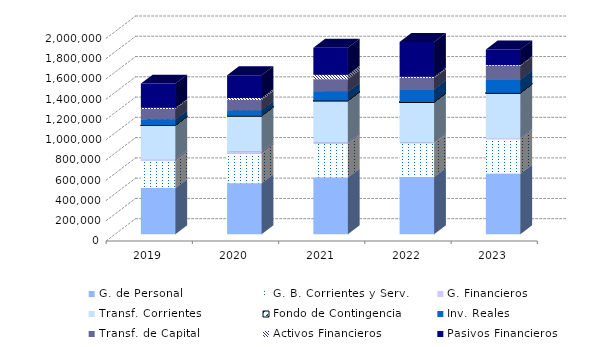
| Category | G. de Personal | G. B. Corrientes y Serv. | G. Financieros | Transf. Corrientes | Fondo de Contingencia | Inv. Reales | Transf. de Capital | Activos Financieros | Pasivos Financieros |
|---|---|---|---|---|---|---|---|---|---|
| 2019.0 | 456311.97 | 266147.25 | 20613.51 | 332276.21 | 1.17 | 57518.51 | 104211.31 | 11093.05 | 238888.3 |
| 2020.0 | 504997.74 | 290355.06 | 22035.15 | 352276.39 | 156.8 | 54913.62 | 100007.88 | 21045.19 | 224040.29 |
| 2021.0 | 559390.09 | 334186.28 | 14213.43 | 410163.53 | 1257.92 | 87547.38 | 122691.37 | 45153.52 | 265755.56 |
| 2022.0 | 566211.62 | 331398.78 | 8003.74 | 399462.66 | 1222.71 | 123720.77 | 112391.6 | 12531.39 | 342950.35 |
| 2023.0 | 598153.22 | 339573.36 | 12054.81 | 445595.26 | 482 | 132215.74 | 135375.62 | 6294.19 | 154839.43 |